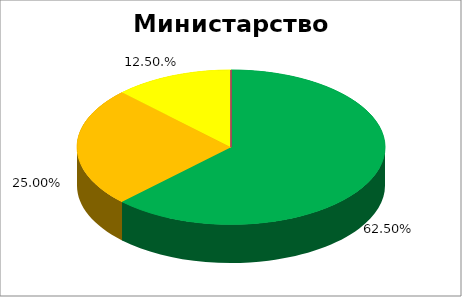
| Category | Министарство правде  |
|---|---|
| 0 | 0.625 |
| 1 | 0.25 |
| 2 | 0.125 |
| 3 | 0 |
| 4 | 0 |